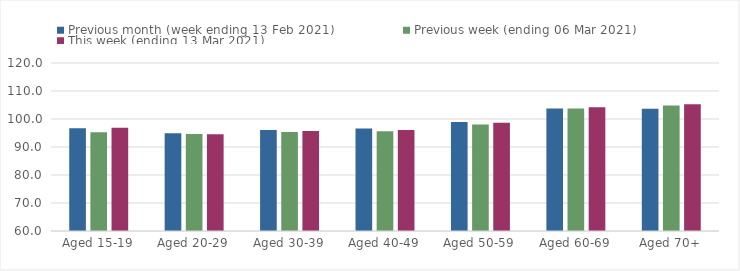
| Category | Previous month (week ending 13 Feb 2021) | Previous week (ending 06 Mar 2021) | This week (ending 13 Mar 2021) |
|---|---|---|---|
| Aged 15-19 | 96.66 | 95.27 | 96.9 |
| Aged 20-29 | 94.94 | 94.62 | 94.57 |
| Aged 30-39 | 96.06 | 95.4 | 95.74 |
| Aged 40-49 | 96.65 | 95.65 | 96.09 |
| Aged 50-59 | 98.91 | 98.08 | 98.64 |
| Aged 60-69 | 103.75 | 103.76 | 104.2 |
| Aged 70+ | 103.66 | 104.82 | 105.28 |